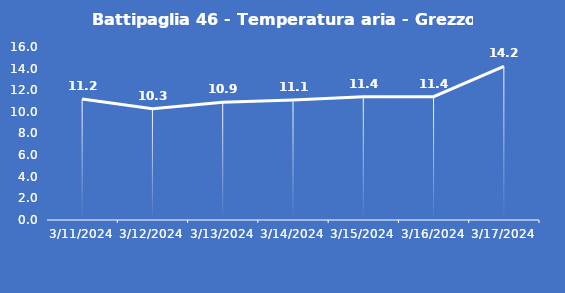
| Category | Battipaglia 46 - Temperatura aria - Grezzo (°C) |
|---|---|
| 3/11/24 | 11.2 |
| 3/12/24 | 10.3 |
| 3/13/24 | 10.9 |
| 3/14/24 | 11.1 |
| 3/15/24 | 11.4 |
| 3/16/24 | 11.4 |
| 3/17/24 | 14.2 |